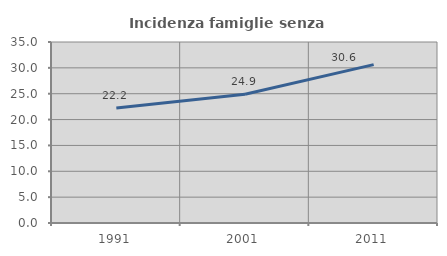
| Category | Incidenza famiglie senza nuclei |
|---|---|
| 1991.0 | 22.23 |
| 2001.0 | 24.891 |
| 2011.0 | 30.619 |